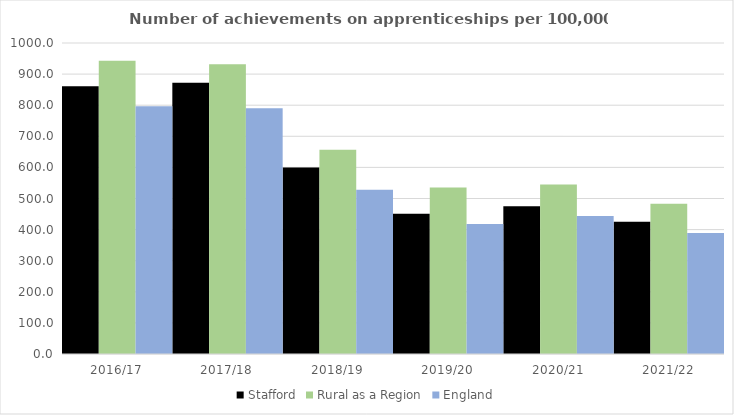
| Category | Stafford | Rural as a Region | England |
|---|---|---|---|
| 2016/17 | 861 | 942.594 | 797 |
| 2017/18 | 872 | 931.709 | 790 |
| 2018/19 | 600 | 656.44 | 528 |
| 2019/20 | 451 | 535.552 | 418 |
| 2020/21 | 475 | 545.333 | 444 |
| 2021/22 | 425 | 482.936 | 389 |